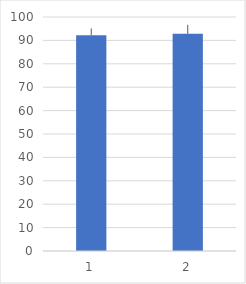
| Category | Series 0 |
|---|---|
| 0 | 92.225 |
| 1 | 92.833 |